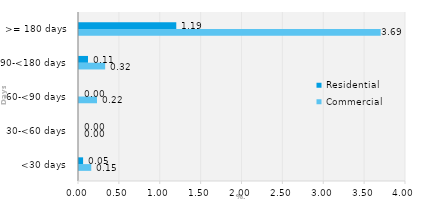
| Category | Commercial | Residential |
|---|---|---|
| <30 days | 0.15 | 0.05 |
| 30-<60 days | 0 | 0 |
| 60-<90 days | 0.22 | 0 |
| 90-<180 days | 0.32 | 0.11 |
| >= 180 days | 3.69 | 1.19 |